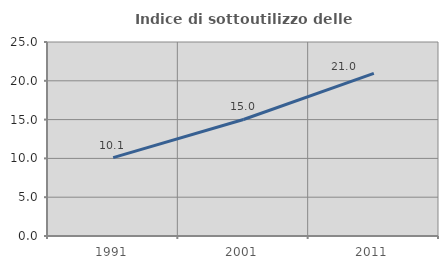
| Category | Indice di sottoutilizzo delle abitazioni  |
|---|---|
| 1991.0 | 10.095 |
| 2001.0 | 15.017 |
| 2011.0 | 20.962 |